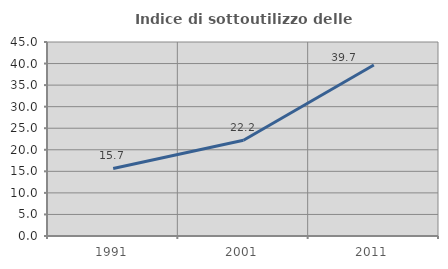
| Category | Indice di sottoutilizzo delle abitazioni  |
|---|---|
| 1991.0 | 15.665 |
| 2001.0 | 22.222 |
| 2011.0 | 39.669 |